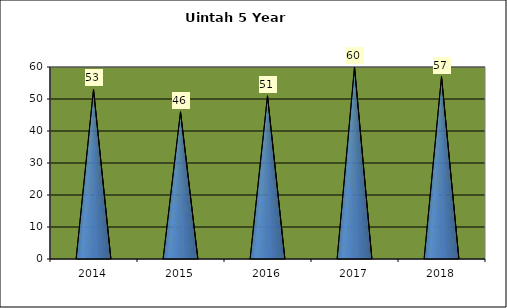
| Category | Washington Terrace April Comparison |
|---|---|
| 0 | 53 |
| 1 | 46 |
| 2 | 51 |
| 3 | 60 |
| 4 | 57 |